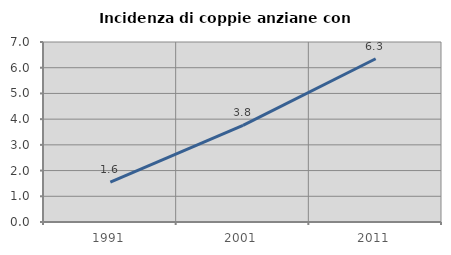
| Category | Incidenza di coppie anziane con figli |
|---|---|
| 1991.0 | 1.55 |
| 2001.0 | 3.759 |
| 2011.0 | 6.349 |